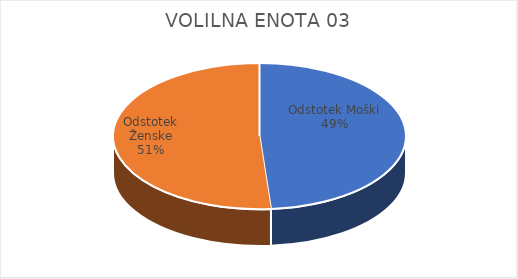
| Category | VOLILNA ENOTA 03 | #REF! | Slovenija skupaj |
|---|---|---|---|
| Odstotek Moški | 8.22 |  | 7.6 |
| Odstotek Ženske | 8.64 |  | 7.35 |